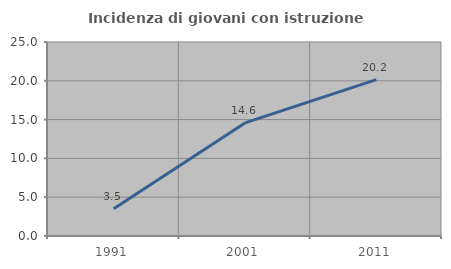
| Category | Incidenza di giovani con istruzione universitaria |
|---|---|
| 1991.0 | 3.509 |
| 2001.0 | 14.57 |
| 2011.0 | 20.155 |